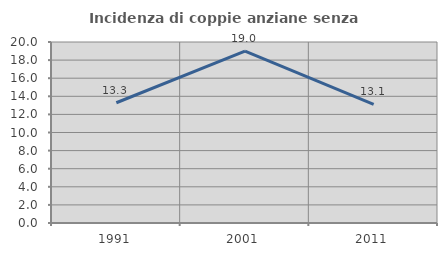
| Category | Incidenza di coppie anziane senza figli  |
|---|---|
| 1991.0 | 13.288 |
| 2001.0 | 18.987 |
| 2011.0 | 13.11 |